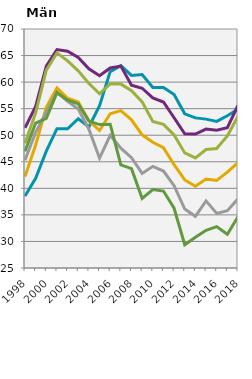
| Category |   -19 år |    20 år |    21 år |    22-25 år |    26-29 år |    30-34 år |
|---|---|---|---|---|---|---|
| 1998.0 | 38.538 | 51.402 | 48.471 | 42.221 | 45.308 | 46.973 |
| 1999.0 | 41.89 | 55.434 | 54.215 | 48.17 | 50.543 | 52.291 |
| 2000.0 | 47.009 | 63.033 | 62.255 | 55.26 | 54.355 | 53.195 |
| 2001.0 | 51.225 | 66.134 | 65.504 | 58.912 | 58.118 | 58.012 |
| 2002.0 | 51.212 | 65.829 | 64.003 | 56.957 | 56.382 | 56.591 |
| 2003.0 | 53.096 | 64.626 | 62.113 | 56.272 | 54.926 | 55.904 |
| 2004.0 | 51.565 | 62.514 | 59.756 | 52.738 | 51.136 | 52.656 |
| 2005.0 | 55.574 | 61.192 | 57.809 | 50.883 | 45.679 | 52.004 |
| 2006.0 | 61.978 | 62.672 | 59.675 | 54.04 | 49.979 | 52.08 |
| 2007.0 | 63.101 | 63.007 | 59.625 | 54.635 | 47.558 | 44.406 |
| 2008.0 | 61.259 | 59.429 | 58.402 | 52.905 | 45.759 | 43.708 |
| 2009.0 | 61.441 | 58.846 | 56.277 | 50.078 | 42.805 | 38.107 |
| 2010.0 | 58.991 | 57.04 | 52.59 | 48.666 | 44.141 | 39.755 |
| 2011.0 | 59.008 | 56.249 | 52.05 | 47.644 | 43.256 | 39.483 |
| 2012.0 | 57.674 | 53.294 | 50.046 | 44.45 | 40.506 | 36.253 |
| 2013.0 | 54.028 | 50.279 | 46.665 | 41.58 | 36.093 | 29.371 |
| 2014.0 | 53.267 | 50.21 | 45.722 | 40.392 | 34.723 | 30.802 |
| 2015.0 | 53.033 | 51.151 | 47.308 | 41.761 | 37.641 | 32.096 |
| 2016.0 | 52.612 | 50.949 | 47.491 | 41.475 | 35.283 | 32.786 |
| 2017.0 | 53.666 | 51.411 | 49.852 | 43.056 | 35.787 | 31.356 |
| 2018.0 | 54.927 | 55.633 | 53.571 | 44.846 | 38.034 | 34.653 |